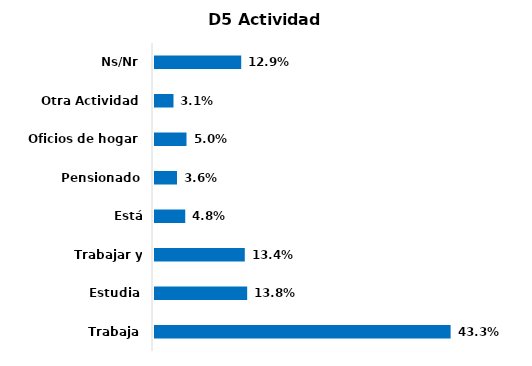
| Category | Series 0 |
|---|---|
| Trabaja | 0.433 |
| Estudia | 0.138 |
| Trabajar y estudiar | 0.134 |
| Está desempleado | 0.048 |
| Pensionado | 0.036 |
| Oficios de hogar | 0.05 |
| Otra Actividad | 0.031 |
| Ns/Nr | 0.129 |